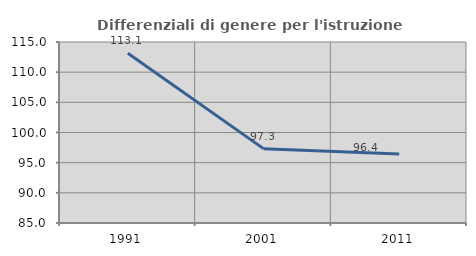
| Category | Differenziali di genere per l'istruzione superiore |
|---|---|
| 1991.0 | 113.146 |
| 2001.0 | 97.325 |
| 2011.0 | 96.421 |